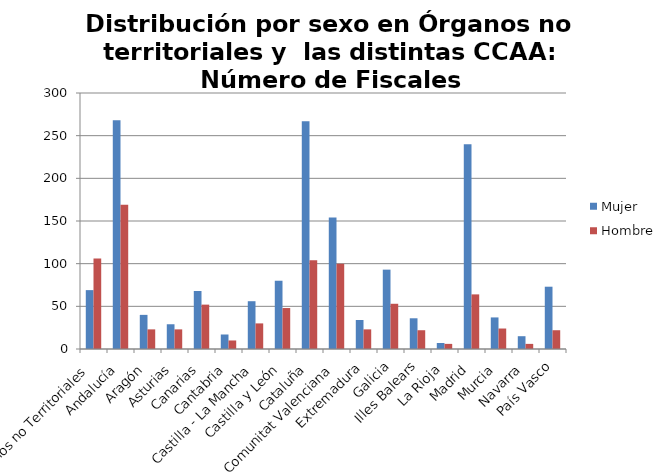
| Category | Mujer | Hombre |
|---|---|---|
| Órganos no Territoriales | 69 | 106 |
| Andalucía | 268 | 169 |
| Aragón | 40 | 23 |
| Asturias | 29 | 23 |
| Canarias | 68 | 52 |
| Cantabria | 17 | 10 |
| Castilla - La Mancha | 56 | 30 |
| Castilla y León | 80 | 48 |
| Cataluña | 267 | 104 |
| Comunitat Valenciana | 154 | 100 |
| Extremadura | 34 | 23 |
| Galicia | 93 | 53 |
| Illes Balears | 36 | 22 |
| La Rioja | 7 | 6 |
| Madrid | 240 | 64 |
| Murcia | 37 | 24 |
| Navarra | 15 | 6 |
| País Vasco | 73 | 22 |